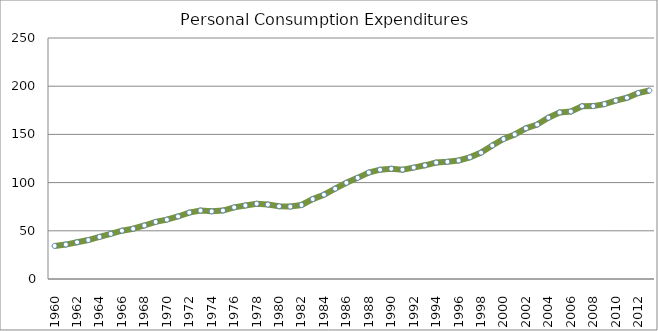
| Category | Series 0 |
|---|---|
| 1960.0 | 34.317 |
| 1961.0 | 35.718 |
| 1962.0 | 38.14 |
| 1963.0 | 40.411 |
| 1964.0 | 43.652 |
| 1965.0 | 46.848 |
| 1966.0 | 50.123 |
| 1967.0 | 52.161 |
| 1968.0 | 55.497 |
| 1969.0 | 59.205 |
| 1970.0 | 61.59 |
| 1971.0 | 64.875 |
| 1972.0 | 68.904 |
| 1973.0 | 70.999 |
| 1974.0 | 70.168 |
| 1975.0 | 71.033 |
| 1976.0 | 74.292 |
| 1977.0 | 76.303 |
| 1978.0 | 78.064 |
| 1979.0 | 77.216 |
| 1980.0 | 75.404 |
| 1981.0 | 75.117 |
| 1982.0 | 76.742 |
| 1983.0 | 82.885 |
| 1984.0 | 87.477 |
| 1985.0 | 93.689 |
| 1986.0 | 99.827 |
| 1987.0 | 104.906 |
| 1988.0 | 110.488 |
| 1989.0 | 113.392 |
| 1990.0 | 114.363 |
| 1991.0 | 113.449 |
| 1992.0 | 115.579 |
| 1993.0 | 117.94 |
| 1994.0 | 120.765 |
| 1995.0 | 121.608 |
| 1996.0 | 122.96 |
| 1997.0 | 126.217 |
| 1998.0 | 131.096 |
| 1999.0 | 138.462 |
| 2000.0 | 145.202 |
| 2001.0 | 149.968 |
| 2002.0 | 156.266 |
| 2003.0 | 160.225 |
| 2004.0 | 167.305 |
| 2005.0 | 172.746 |
| 2006.0 | 173.762 |
| 2007.0 | 179.196 |
| 2008.0 | 179.351 |
| 2009.0 | 181.408 |
| 2010.0 | 185.064 |
| 2011.0 | 187.993 |
| 2012.0 | 192.892 |
| 2013.0 | 195.501 |